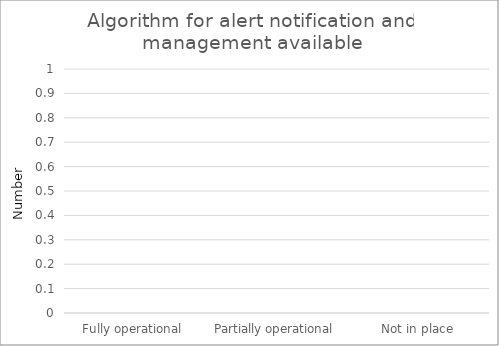
| Category | Algorithm for alert notification and management available |
|---|---|
| Fully operational | 0 |
| Partially operational | 0 |
| Not in place | 0 |